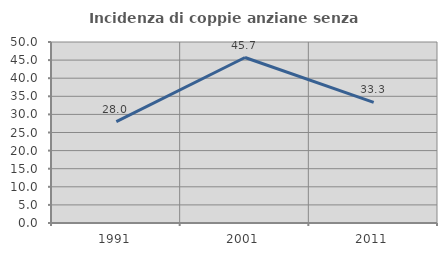
| Category | Incidenza di coppie anziane senza figli  |
|---|---|
| 1991.0 | 28 |
| 2001.0 | 45.714 |
| 2011.0 | 33.333 |